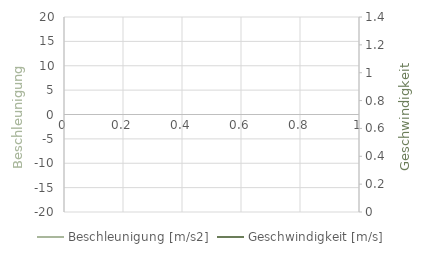
| Category | Beschleunigung [m/s2] |
|---|---|
| 0 | 0 |
| 1 | 18 |
| 2 | 18 |
| 3 | 18 |
| 4 | 18 |
| 5 | 18 |
| 6 | 18 |
| 7 | 18 |
| 8 | 18 |
| 9 | 18 |
| 10 | 18 |
| 11 | 18 |
| 12 | 18 |
| 13 | 18 |
| 14 | 18 |
| 15 | 18 |
| 16 | 18 |
| 17 | 18 |
| 18 | 18 |
| 19 | 18 |
| 20 | 18 |
| 21 | 18 |
| 22 | 18 |
| 23 | 18 |
| 24 | 18 |
| 25 | 18 |
| 26 | 18 |
| 27 | 18 |
| 28 | 18 |
| 29 | 18 |
| 30 | 18 |
| 31 | 18 |
| 32 | 18 |
| 33 | 18 |
| 34 | 18 |
| 35 | 18 |
| 36 | 18 |
| 37 | 18 |
| 38 | 18 |
| 39 | 18 |
| 40 | 18 |
| 41 | 18 |
| 42 | 18 |
| 43 | 18 |
| 44 | 18 |
| 45 | 18 |
| 46 | 18 |
| 47 | 18 |
| 48 | 18 |
| 49 | 18 |
| 50 | 18 |
| 51 | 18 |
| 52 | 18 |
| 53 | 18 |
| 54 | 18 |
| 55 | 18 |
| 56 | 18 |
| 57 | 18 |
| 58 | 18 |
| 59 | 18 |
| 60 | 18 |
| 61 | 18 |
| 62 | 18 |
| 63 | 18 |
| 64 | 18 |
| 65 | 18 |
| 66 | 18 |
| 67 | 18 |
| 68 | 18 |
| 69 | 18 |
| 70 | 18 |
| 71 | 18 |
| 72 | 18 |
| 73 | 18 |
| 74 | 18 |
| 75 | 18 |
| 76 | 18 |
| 77 | 18 |
| 78 | 18 |
| 79 | 18 |
| 80 | 18 |
| 81 | 18 |
| 82 | 18 |
| 83 | 18 |
| 84 | 18 |
| 85 | 18 |
| 86 | 18 |
| 87 | 18 |
| 88 | 18 |
| 89 | 18 |
| 90 | 18 |
| 91 | 18 |
| 92 | 18 |
| 93 | 18 |
| 94 | 18 |
| 95 | 18 |
| 96 | 18 |
| 97 | 18 |
| 98 | 18 |
| 99 | 18 |
| 100 | 18 |
| 101 | 18 |
| 102 | 18 |
| 103 | 18 |
| 104 | 18 |
| 105 | 18 |
| 106 | 18 |
| 107 | 18 |
| 108 | 18 |
| 109 | 18 |
| 110 | 18 |
| 111 | 18 |
| 112 | 18 |
| 113 | 18 |
| 114 | 18 |
| 115 | 18 |
| 116 | 18 |
| 117 | 18 |
| 118 | 18 |
| 119 | 18 |
| 120 | 18 |
| 121 | 18 |
| 122 | 18 |
| 123 | 18 |
| 124 | 18 |
| 125 | 18 |
| 126 | 18 |
| 127 | 18 |
| 128 | 18 |
| 129 | 18 |
| 130 | 18 |
| 131 | 18 |
| 132 | 18 |
| 133 | 18 |
| 134 | 18 |
| 135 | 18 |
| 136 | 18 |
| 137 | 18 |
| 138 | 18 |
| 139 | 18 |
| 140 | 18 |
| 141 | 18 |
| 142 | 18 |
| 143 | 18 |
| 144 | 18 |
| 145 | 18 |
| 146 | 18 |
| 147 | 18 |
| 148 | 18 |
| 149 | 18 |
| 150 | 18 |
| 151 | 18 |
| 152 | 18 |
| 153 | 18 |
| 154 | 18 |
| 155 | 18 |
| 156 | 18 |
| 157 | 18 |
| 158 | 18 |
| 159 | 18 |
| 160 | 18 |
| 161 | 18 |
| 162 | 18 |
| 163 | 18 |
| 164 | 18 |
| 165 | 18 |
| 166 | 18 |
| 167 | 18 |
| 168 | 18 |
| 169 | 18 |
| 170 | 18 |
| 171 | 18 |
| 172 | 18 |
| 173 | 18 |
| 174 | 18 |
| 175 | 18 |
| 176 | 18 |
| 177 | 18 |
| 178 | 18 |
| 179 | 18 |
| 180 | 18 |
| 181 | 18 |
| 182 | 18 |
| 183 | 18 |
| 184 | 18 |
| 185 | 18 |
| 186 | 18 |
| 187 | 18 |
| 188 | 18 |
| 189 | 18 |
| 190 | 18 |
| 191 | 0 |
| 192 | 0 |
| 193 | 0 |
| 194 | 0 |
| 195 | 0 |
| 196 | 0 |
| 197 | 0 |
| 198 | 0 |
| 199 | 0 |
| 200 | 0 |
| 201 | 0 |
| 202 | 0 |
| 203 | 0 |
| 204 | 0 |
| 205 | 0 |
| 206 | 0 |
| 207 | 0 |
| 208 | 0 |
| 209 | 0 |
| 210 | 0 |
| 211 | 0 |
| 212 | 0 |
| 213 | 0 |
| 214 | 0 |
| 215 | 0 |
| 216 | 0 |
| 217 | 0 |
| 218 | 0 |
| 219 | 0 |
| 220 | 0 |
| 221 | 0 |
| 222 | 0 |
| 223 | 0 |
| 224 | 0 |
| 225 | 0 |
| 226 | 0 |
| 227 | 0 |
| 228 | 0 |
| 229 | 0 |
| 230 | 0 |
| 231 | 0 |
| 232 | 0 |
| 233 | 0 |
| 234 | 0 |
| 235 | 0 |
| 236 | 0 |
| 237 | 0 |
| 238 | 0 |
| 239 | -18 |
| 240 | -18 |
| 241 | -18 |
| 242 | -18 |
| 243 | -18 |
| 244 | -18 |
| 245 | -18 |
| 246 | -18 |
| 247 | -18 |
| 248 | -18 |
| 249 | -18 |
| 250 | -18 |
| 251 | -18 |
| 252 | -18 |
| 253 | -18 |
| 254 | -18 |
| 255 | -18 |
| 256 | -18 |
| 257 | -18 |
| 258 | -18 |
| 259 | -18 |
| 260 | -18 |
| 261 | -18 |
| 262 | -18 |
| 263 | -18 |
| 264 | -18 |
| 265 | -18 |
| 266 | -18 |
| 267 | -18 |
| 268 | -18 |
| 269 | -18 |
| 270 | -18 |
| 271 | -18 |
| 272 | -18 |
| 273 | -18 |
| 274 | -18 |
| 275 | -18 |
| 276 | -18 |
| 277 | -18 |
| 278 | -18 |
| 279 | -18 |
| 280 | -18 |
| 281 | -18 |
| 282 | -18 |
| 283 | -18 |
| 284 | -18 |
| 285 | -18 |
| 286 | -18 |
| 287 | -18 |
| 288 | -18 |
| 289 | -18 |
| 290 | -18 |
| 291 | -18 |
| 292 | -18 |
| 293 | -18 |
| 294 | -18 |
| 295 | -18 |
| 296 | -18 |
| 297 | -18 |
| 298 | -18 |
| 299 | -18 |
| 300 | -18 |
| 301 | -18 |
| 302 | -18 |
| 303 | -18 |
| 304 | -18 |
| 305 | -18 |
| 306 | -18 |
| 307 | -18 |
| 308 | -18 |
| 309 | -18 |
| 310 | -18 |
| 311 | -18 |
| 312 | -18 |
| 313 | -18 |
| 314 | -18 |
| 315 | -18 |
| 316 | -18 |
| 317 | -18 |
| 318 | -18 |
| 319 | -18 |
| 320 | -18 |
| 321 | -18 |
| 322 | -18 |
| 323 | -18 |
| 324 | -18 |
| 325 | -18 |
| 326 | -18 |
| 327 | -18 |
| 328 | -18 |
| 329 | -18 |
| 330 | -18 |
| 331 | -18 |
| 332 | -18 |
| 333 | -18 |
| 334 | -18 |
| 335 | -18 |
| 336 | -18 |
| 337 | -18 |
| 338 | -18 |
| 339 | -18 |
| 340 | -18 |
| 341 | -18 |
| 342 | -18 |
| 343 | -18 |
| 344 | -18 |
| 345 | -18 |
| 346 | -18 |
| 347 | -18 |
| 348 | -18 |
| 349 | -18 |
| 350 | -18 |
| 351 | -18 |
| 352 | -18 |
| 353 | -18 |
| 354 | -18 |
| 355 | -18 |
| 356 | -18 |
| 357 | -18 |
| 358 | -18 |
| 359 | -18 |
| 360 | -18 |
| 361 | -18 |
| 362 | -18 |
| 363 | -18 |
| 364 | -18 |
| 365 | -18 |
| 366 | -18 |
| 367 | -18 |
| 368 | -18 |
| 369 | -18 |
| 370 | -18 |
| 371 | -18 |
| 372 | -18 |
| 373 | -18 |
| 374 | -18 |
| 375 | -18 |
| 376 | -18 |
| 377 | -18 |
| 378 | -18 |
| 379 | -18 |
| 380 | -18 |
| 381 | -18 |
| 382 | -18 |
| 383 | -18 |
| 384 | -18 |
| 385 | -18 |
| 386 | -18 |
| 387 | -18 |
| 388 | -18 |
| 389 | -18 |
| 390 | -18 |
| 391 | -18 |
| 392 | -18 |
| 393 | -18 |
| 394 | -18 |
| 395 | -18 |
| 396 | -18 |
| 397 | -18 |
| 398 | -18 |
| 399 | -18 |
| 400 | -18 |
| 401 | -18 |
| 402 | -18 |
| 403 | -18 |
| 404 | -18 |
| 405 | -18 |
| 406 | -18 |
| 407 | -18 |
| 408 | -18 |
| 409 | -18 |
| 410 | -18 |
| 411 | -18 |
| 412 | -18 |
| 413 | -18 |
| 414 | -18 |
| 415 | -18 |
| 416 | -18 |
| 417 | -18 |
| 418 | -18 |
| 419 | -18 |
| 420 | -18 |
| 421 | -18 |
| 422 | -18 |
| 423 | -18 |
| 424 | -18 |
| 425 | -18 |
| 426 | -18 |
| 427 | -18 |
| 428 | -18 |
| 429 | 0 |
| 430 | 0 |
| 431 | 0 |
| 432 | 0 |
| 433 | 0 |
| 434 | 0 |
| 435 | 0 |
| 436 | 0 |
| 437 | 0 |
| 438 | 0 |
| 439 | 0 |
| 440 | 0 |
| 441 | 0 |
| 442 | 0 |
| 443 | 0 |
| 444 | 0 |
| 445 | 0 |
| 446 | 0 |
| 447 | 0 |
| 448 | 0 |
| 449 | 0 |
| 450 | 0 |
| 451 | 0 |
| 452 | 0 |
| 453 | 0 |
| 454 | 0 |
| 455 | 0 |
| 456 | 0 |
| 457 | 0 |
| 458 | 0 |
| 459 | 0 |
| 460 | 0 |
| 461 | 0 |
| 462 | 0 |
| 463 | 0 |
| 464 | 0 |
| 465 | 0 |
| 466 | 0 |
| 467 | 0 |
| 468 | 0 |
| 469 | 0 |
| 470 | 0 |
| 471 | 0 |
| 472 | 0 |
| 473 | 0 |
| 474 | 0 |
| 475 | 0 |
| 476 | 0 |
| 477 | 0 |
| 478 | 0 |
| 479 | 0 |
| 480 | 0 |
| 481 | 0 |
| 482 | 0 |
| 483 | 0 |
| 484 | 0 |
| 485 | 0 |
| 486 | 0 |
| 487 | 0 |
| 488 | 0 |
| 489 | 0 |
| 490 | 0 |
| 491 | 0 |
| 492 | 0 |
| 493 | 0 |
| 494 | 0 |
| 495 | 0 |
| 496 | 0 |
| 497 | 0 |
| 498 | 0 |
| 499 | 0 |
| 500 | 0 |
| 501 | 0 |
| 502 | 0 |
| 503 | 0 |
| 504 | 0 |
| 505 | 0 |
| 506 | 0 |
| 507 | 0 |
| 508 | 0 |
| 509 | 0 |
| 510 | 0 |
| 511 | 0 |
| 512 | 0 |
| 513 | 0 |
| 514 | 0 |
| 515 | 0 |
| 516 | 0 |
| 517 | 0 |
| 518 | 0 |
| 519 | 0 |
| 520 | 0 |
| 521 | 0 |
| 522 | 0 |
| 523 | 0 |
| 524 | 0 |
| 525 | 0 |
| 526 | 0 |
| 527 | 0 |
| 528 | 0 |
| 529 | 0 |
| 530 | 0 |
| 531 | 0 |
| 532 | 0 |
| 533 | 0 |
| 534 | 0 |
| 535 | 0 |
| 536 | 0 |
| 537 | 0 |
| 538 | 0 |
| 539 | 0 |
| 540 | 0 |
| 541 | 0 |
| 542 | 0 |
| 543 | 0 |
| 544 | 0 |
| 545 | 0 |
| 546 | 0 |
| 547 | 0 |
| 548 | 0 |
| 549 | 0 |
| 550 | 0 |
| 551 | 0 |
| 552 | 0 |
| 553 | 0 |
| 554 | 0 |
| 555 | 0 |
| 556 | 0 |
| 557 | 0 |
| 558 | 0 |
| 559 | 0 |
| 560 | 0 |
| 561 | 0 |
| 562 | 0 |
| 563 | 0 |
| 564 | 0 |
| 565 | 0 |
| 566 | 0 |
| 567 | 0 |
| 568 | 0 |
| 569 | 0 |
| 570 | 0 |
| 571 | 0 |
| 572 | 0 |
| 573 | 0 |
| 574 | 0 |
| 575 | 0 |
| 576 | 0 |
| 577 | 0 |
| 578 | 0 |
| 579 | 0 |
| 580 | 0 |
| 581 | 0 |
| 582 | 0 |
| 583 | 0 |
| 584 | 0 |
| 585 | 0 |
| 586 | 0 |
| 587 | 0 |
| 588 | 0 |
| 589 | 0 |
| 590 | 0 |
| 591 | 0 |
| 592 | 0 |
| 593 | 0 |
| 594 | 0 |
| 595 | 0 |
| 596 | 0 |
| 597 | 0 |
| 598 | 0 |
| 599 | 0 |
| 600 | 0 |
| 601 | 0 |
| 602 | 0 |
| 603 | 0 |
| 604 | 0 |
| 605 | 0 |
| 606 | 0 |
| 607 | 0 |
| 608 | 0 |
| 609 | 0 |
| 610 | 0 |
| 611 | 0 |
| 612 | 0 |
| 613 | 0 |
| 614 | 0 |
| 615 | 0 |
| 616 | 0 |
| 617 | 0 |
| 618 | 0 |
| 619 | 0 |
| 620 | 0 |
| 621 | 0 |
| 622 | 0 |
| 623 | 0 |
| 624 | 0 |
| 625 | 0 |
| 626 | 0 |
| 627 | 0 |
| 628 | 0 |
| 629 | 0 |
| 630 | 0 |
| 631 | 0 |
| 632 | 0 |
| 633 | 0 |
| 634 | 0 |
| 635 | 0 |
| 636 | 0 |
| 637 | 0 |
| 638 | 0 |
| 639 | 0 |
| 640 | 0 |
| 641 | 0 |
| 642 | 0 |
| 643 | 0 |
| 644 | 0 |
| 645 | 0 |
| 646 | 0 |
| 647 | 0 |
| 648 | 0 |
| 649 | 0 |
| 650 | 0 |
| 651 | 0 |
| 652 | 0 |
| 653 | 0 |
| 654 | 0 |
| 655 | 0 |
| 656 | 0 |
| 657 | 0 |
| 658 | 0 |
| 659 | 0 |
| 660 | 0 |
| 661 | 0 |
| 662 | 0 |
| 663 | 0 |
| 664 | 0 |
| 665 | 0 |
| 666 | 0 |
| 667 | 0 |
| 668 | 0 |
| 669 | 0 |
| 670 | 0 |
| 671 | 0 |
| 672 | 0 |
| 673 | 0 |
| 674 | 0 |
| 675 | 0 |
| 676 | 0 |
| 677 | 0 |
| 678 | 0 |
| 679 | 0 |
| 680 | 0 |
| 681 | 0 |
| 682 | 0 |
| 683 | 0 |
| 684 | 0 |
| 685 | 0 |
| 686 | 0 |
| 687 | 0 |
| 688 | 0 |
| 689 | 0 |
| 690 | 0 |
| 691 | 0 |
| 692 | 0 |
| 693 | 0 |
| 694 | 0 |
| 695 | 0 |
| 696 | 0 |
| 697 | 0 |
| 698 | 0 |
| 699 | 0 |
| 700 | 0 |
| 701 | 0 |
| 702 | 0 |
| 703 | 0 |
| 704 | 0 |
| 705 | 0 |
| 706 | 0 |
| 707 | 0 |
| 708 | 0 |
| 709 | 0 |
| 710 | 0 |
| 711 | 0 |
| 712 | 0 |
| 713 | 0 |
| 714 | 0 |
| 715 | 0 |
| 716 | 0 |
| 717 | 0 |
| 718 | 0 |
| 719 | 0 |
| 720 | 0 |
| 721 | 0 |
| 722 | 0 |
| 723 | 0 |
| 724 | 0 |
| 725 | 0 |
| 726 | 0 |
| 727 | 0 |
| 728 | 0 |
| 729 | 0 |
| 730 | 0 |
| 731 | 0 |
| 732 | 0 |
| 733 | 0 |
| 734 | 0 |
| 735 | 0 |
| 736 | 0 |
| 737 | 0 |
| 738 | 0 |
| 739 | 0 |
| 740 | 0 |
| 741 | 0 |
| 742 | 0 |
| 743 | 0 |
| 744 | 0 |
| 745 | 0 |
| 746 | 0 |
| 747 | 0 |
| 748 | 0 |
| 749 | 0 |
| 750 | 0 |
| 751 | 0 |
| 752 | 0 |
| 753 | 0 |
| 754 | 0 |
| 755 | 0 |
| 756 | 0 |
| 757 | 0 |
| 758 | 0 |
| 759 | 0 |
| 760 | 0 |
| 761 | 0 |
| 762 | 0 |
| 763 | 0 |
| 764 | 0 |
| 765 | 0 |
| 766 | 0 |
| 767 | 0 |
| 768 | 0 |
| 769 | 0 |
| 770 | 0 |
| 771 | 0 |
| 772 | 0 |
| 773 | 0 |
| 774 | 0 |
| 775 | 0 |
| 776 | 0 |
| 777 | 0 |
| 778 | 0 |
| 779 | 0 |
| 780 | 0 |
| 781 | 0 |
| 782 | 0 |
| 783 | 0 |
| 784 | 0 |
| 785 | 0 |
| 786 | 0 |
| 787 | 0 |
| 788 | 0 |
| 789 | 0 |
| 790 | 0 |
| 791 | 0 |
| 792 | 0 |
| 793 | 0 |
| 794 | 0 |
| 795 | 0 |
| 796 | 0 |
| 797 | 0 |
| 798 | 0 |
| 799 | 0 |
| 800 | 0 |
| 801 | 0 |
| 802 | 0 |
| 803 | 0 |
| 804 | 0 |
| 805 | 0 |
| 806 | 0 |
| 807 | 0 |
| 808 | 0 |
| 809 | 0 |
| 810 | 0 |
| 811 | 0 |
| 812 | 0 |
| 813 | 0 |
| 814 | 0 |
| 815 | 0 |
| 816 | 0 |
| 817 | 0 |
| 818 | 0 |
| 819 | 0 |
| 820 | 0 |
| 821 | 0 |
| 822 | 0 |
| 823 | 0 |
| 824 | 0 |
| 825 | 0 |
| 826 | 0 |
| 827 | 0 |
| 828 | 0 |
| 829 | 0 |
| 830 | 0 |
| 831 | 0 |
| 832 | 0 |
| 833 | 0 |
| 834 | 0 |
| 835 | 0 |
| 836 | 0 |
| 837 | 0 |
| 838 | 0 |
| 839 | 0 |
| 840 | 0 |
| 841 | 0 |
| 842 | 0 |
| 843 | 0 |
| 844 | 0 |
| 845 | 0 |
| 846 | 0 |
| 847 | 0 |
| 848 | 0 |
| 849 | 0 |
| 850 | 0 |
| 851 | 0 |
| 852 | 0 |
| 853 | 0 |
| 854 | 0 |
| 855 | 0 |
| 856 | 0 |
| 857 | 0 |
| 858 | 0 |
| 859 | 0 |
| 860 | 0 |
| 861 | 0 |
| 862 | 0 |
| 863 | 0 |
| 864 | 0 |
| 865 | 0 |
| 866 | 0 |
| 867 | 0 |
| 868 | 0 |
| 869 | 0 |
| 870 | 0 |
| 871 | 0 |
| 872 | 0 |
| 873 | 0 |
| 874 | 0 |
| 875 | 0 |
| 876 | 0 |
| 877 | 0 |
| 878 | 0 |
| 879 | 0 |
| 880 | 0 |
| 881 | 0 |
| 882 | 0 |
| 883 | 0 |
| 884 | 0 |
| 885 | 0 |
| 886 | 0 |
| 887 | 0 |
| 888 | 0 |
| 889 | 0 |
| 890 | 0 |
| 891 | 0 |
| 892 | 0 |
| 893 | 0 |
| 894 | 0 |
| 895 | 0 |
| 896 | 0 |
| 897 | 0 |
| 898 | 0 |
| 899 | 0 |
| 900 | 0 |
| 901 | 0 |
| 902 | 0 |
| 903 | 0 |
| 904 | 0 |
| 905 | 0 |
| 906 | 0 |
| 907 | 0 |
| 908 | 0 |
| 909 | 0 |
| 910 | 0 |
| 911 | 0 |
| 912 | 0 |
| 913 | 0 |
| 914 | 0 |
| 915 | 0 |
| 916 | 0 |
| 917 | 0 |
| 918 | 0 |
| 919 | 0 |
| 920 | 0 |
| 921 | 0 |
| 922 | 0 |
| 923 | 0 |
| 924 | 0 |
| 925 | 0 |
| 926 | 0 |
| 927 | 0 |
| 928 | 0 |
| 929 | 0 |
| 930 | 0 |
| 931 | 0 |
| 932 | 0 |
| 933 | 0 |
| 934 | 0 |
| 935 | 0 |
| 936 | 0 |
| 937 | 0 |
| 938 | 0 |
| 939 | 0 |
| 940 | 0 |
| 941 | 0 |
| 942 | 0 |
| 943 | 0 |
| 944 | 0 |
| 945 | 0 |
| 946 | 0 |
| 947 | 0 |
| 948 | 0 |
| 949 | 0 |
| 950 | 0 |
| 951 | 0 |
| 952 | 0 |
| 953 | 0 |
| 954 | 0 |
| 955 | 0 |
| 956 | 0 |
| 957 | 0 |
| 958 | 0 |
| 959 | 0 |
| 960 | 0 |
| 961 | 0 |
| 962 | 0 |
| 963 | 0 |
| 964 | 0 |
| 965 | 0 |
| 966 | 0 |
| 967 | 0 |
| 968 | 0 |
| 969 | 0 |
| 970 | 0 |
| 971 | 0 |
| 972 | 0 |
| 973 | 0 |
| 974 | 0 |
| 975 | 0 |
| 976 | 0 |
| 977 | 0 |
| 978 | 0 |
| 979 | 0 |
| 980 | 0 |
| 981 | 0 |
| 982 | 0 |
| 983 | 0 |
| 984 | 0 |
| 985 | 0 |
| 986 | 0 |
| 987 | 0 |
| 988 | 0 |
| 989 | 0 |
| 990 | 0 |
| 991 | 0 |
| 992 | 0 |
| 993 | 0 |
| 994 | 0 |
| 995 | 0 |
| 996 | 0 |
| 997 | 0 |
| 998 | 0 |
| 999 | 0 |
| 1000 | 0 |